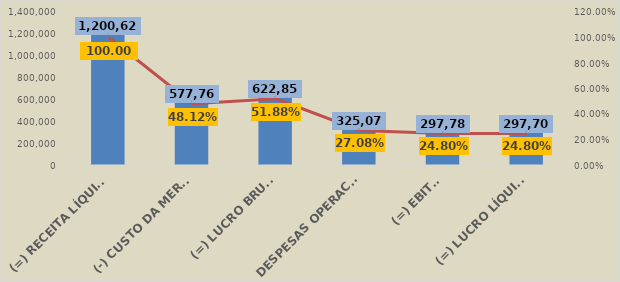
| Category | Em R$ 1 |
|---|---|
| (=) RECEITA LÍQUIDA DE VENDAS | 1200621.655 |
| (-) CUSTO DA MERCADORIA VENDIDA (CMV) | 577768.55 |
| (=) LUCRO BRUTO | 622853.105 |
| DESPESAS OPERACIONAIS | 325070.771 |
| (=) EBITDA | 297782.334 |
| (=) LUCRO LÍQUIDO | 297700.734 |